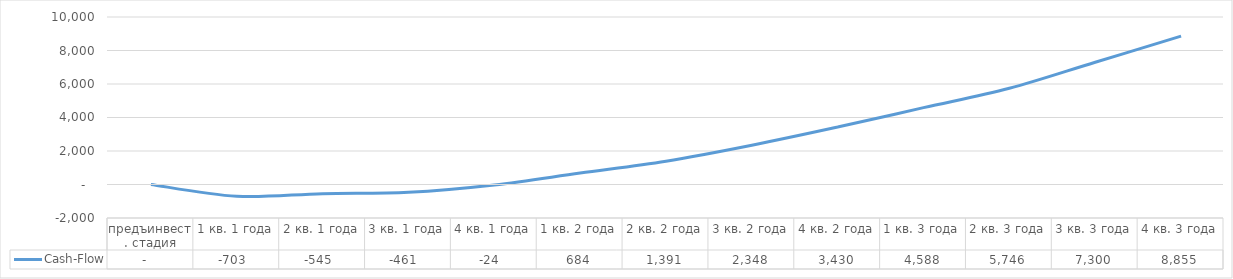
| Category | Cash-Flow |
|---|---|
| предъинвест. стадия | 0 |
| 1 кв. 1 года | -702.722 |
| 2 кв. 1 года | -544.996 |
| 3 кв. 1 года | -461.008 |
| 4 кв. 1 года | -23.77 |
| 1 кв. 2 года | 683.594 |
| 2 кв. 2 года | 1390.957 |
| 3 кв. 2 года | 2347.951 |
| 4 кв. 2 года | 3429.759 |
| 1 кв. 3 года | 4587.64 |
| 2 кв. 3 года | 5745.522 |
| 3 кв. 3 года | 7300.315 |
| 4 кв. 3 года | 8855.108 |